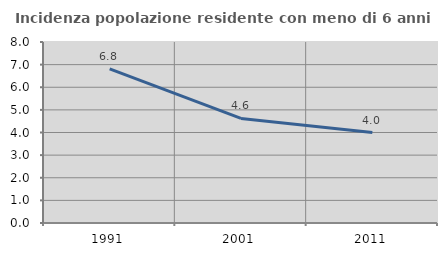
| Category | Incidenza popolazione residente con meno di 6 anni |
|---|---|
| 1991.0 | 6.809 |
| 2001.0 | 4.622 |
| 2011.0 | 4 |